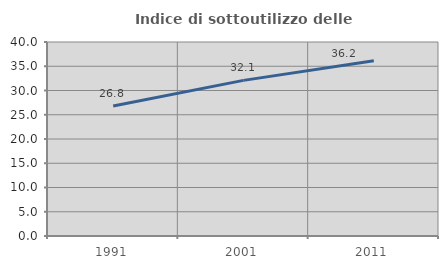
| Category | Indice di sottoutilizzo delle abitazioni  |
|---|---|
| 1991.0 | 26.821 |
| 2001.0 | 32.09 |
| 2011.0 | 36.152 |